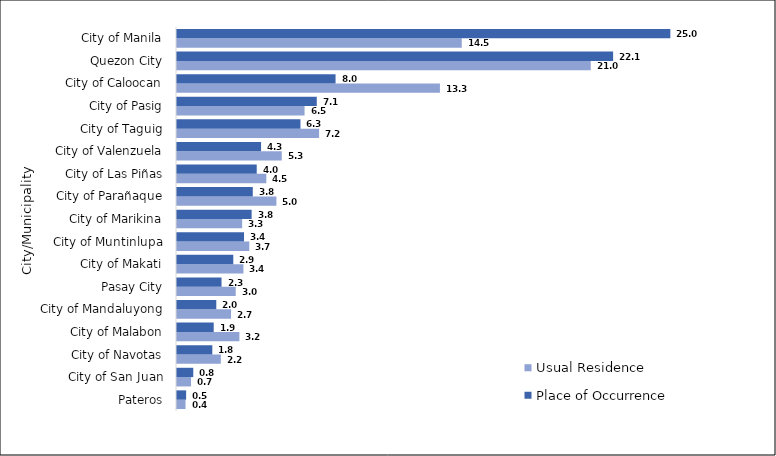
| Category |  Usual Residence  |  Place of Occurrence  |
|---|---|---|
|  Pateros | 0.432 | 0.463 |
|  City of San Juan | 0.713 | 0.826 |
|  City of Navotas | 2.226 | 1.793 |
|  City of Malabon | 3.168 | 1.863 |
|  City of Mandaluyong | 2.743 | 1.995 |
|  Pasay City | 2.981 | 2.261 |
|  City of Makati | 3.371 | 2.857 |
|  City of Muntinlupa | 3.669 | 3.402 |
|  City of Marikina | 3.307 | 3.789 |
|  City of Parañaque | 5.046 | 3.847 |
|  City of Las Piñas | 4.534 | 4.047 |
|  City of Valenzuela | 5.317 | 4.268 |
|  City of Taguig | 7.213 | 6.266 |
|  City of Pasig | 6.475 | 7.095 |
|  City of Caloocan | 13.347 | 8.049 |
|  Quezon City | 21.001 | 22.138 |
|  City of Manila | 14.455 | 25.043 |